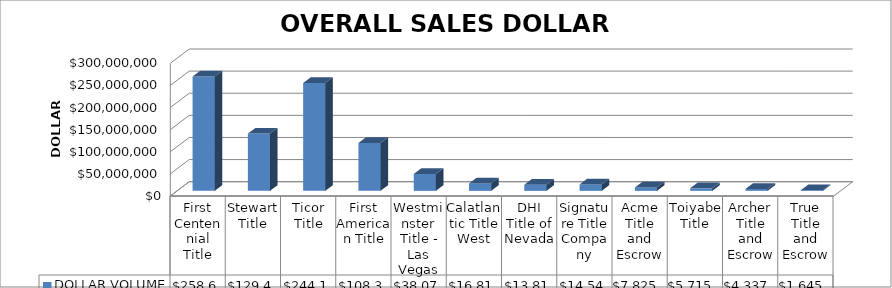
| Category | DOLLAR VOLUME |
|---|---|
| First Centennial Title | 258658502.27 |
| Stewart Title | 129428820.29 |
| Ticor Title | 244119325 |
| First American Title | 108344445.86 |
| Westminster Title - Las Vegas | 38071950 |
| Calatlantic Title West | 16819758 |
| DHI Title of Nevada | 13819520 |
| Signature Title Company | 14545400 |
| Acme Title and Escrow | 7825227.5 |
| Toiyabe Title | 5715100 |
| Archer Title and Escrow | 4337000 |
| True Title and Escrow | 1645000 |